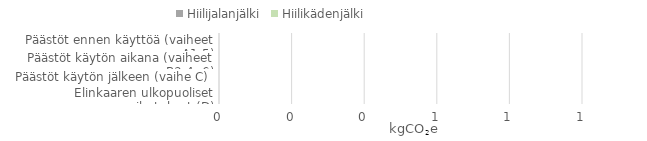
| Category | Hiilijalanjälki | Hiilikädenjälki |
|---|---|---|
| Elinkaaren ulkopuoliset vaikutukset (D) | 0 | 0 |
| Päästöt käytön jälkeen (vaihe C) | 0 | 0 |
| Päästöt käytön aikana (vaiheet B3-4, 6) | 0 | 0 |
| Päästöt ennen käyttöä (vaiheet A1-5) | 0 | 0 |